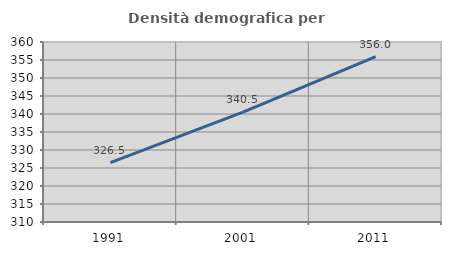
| Category | Densità demografica |
|---|---|
| 1991.0 | 326.511 |
| 2001.0 | 340.495 |
| 2011.0 | 355.962 |